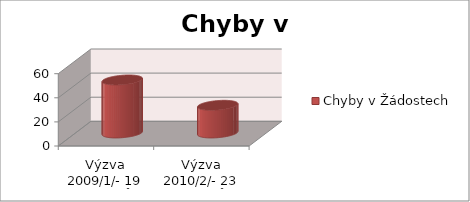
| Category | Chyby v Žádostech |
|---|---|
| Výzva 2009/1/- 19 projektů | 44 |
| Výzva 2010/2/- 23 projektů  | 23 |